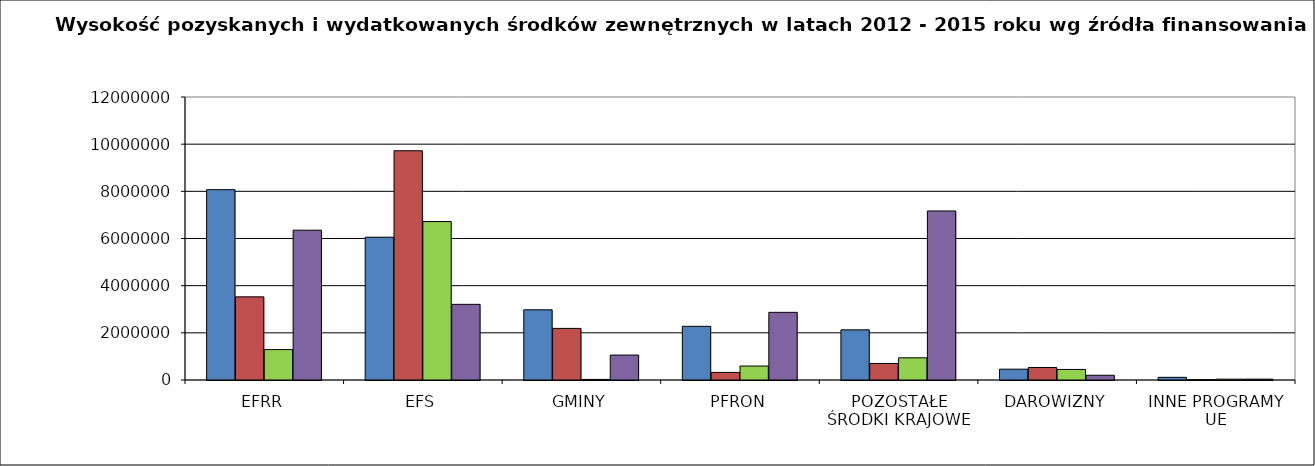
| Category | 2015 | 2014 | 2013 | 2012 |
|---|---|---|---|---|
| EFRR | 8071135.66 | 3526040.93 | 1288838.25 | 6352641.51 |
| EFS | 6054749.06 | 9721882.91 | 6718274.06 | 3208549.73 |
| GMINY | 2976863.39 | 2188280.15 | 23887.28 | 1056930.58 |
| PFRON | 2276451.97 | 322200.38 | 592423.56 | 2869154.23 |
| POZOSTAŁE ŚRODKI KRAJOWE | 2126571.68 | 701448.64 | 941061.33 | 7168578.13 |
| DAROWIZNY | 458644.16 | 528742.2 | 447764.22 | 200833.71 |
| INNE PROGRAMY UE | 113738 | 14459.5 | 36316 | 36914.44 |